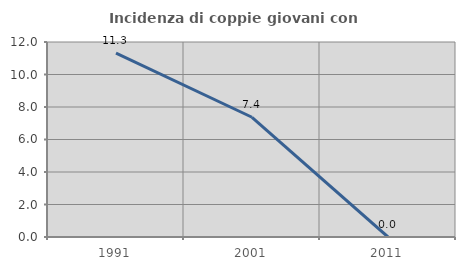
| Category | Incidenza di coppie giovani con figli |
|---|---|
| 1991.0 | 11.321 |
| 2001.0 | 7.368 |
| 2011.0 | 0 |